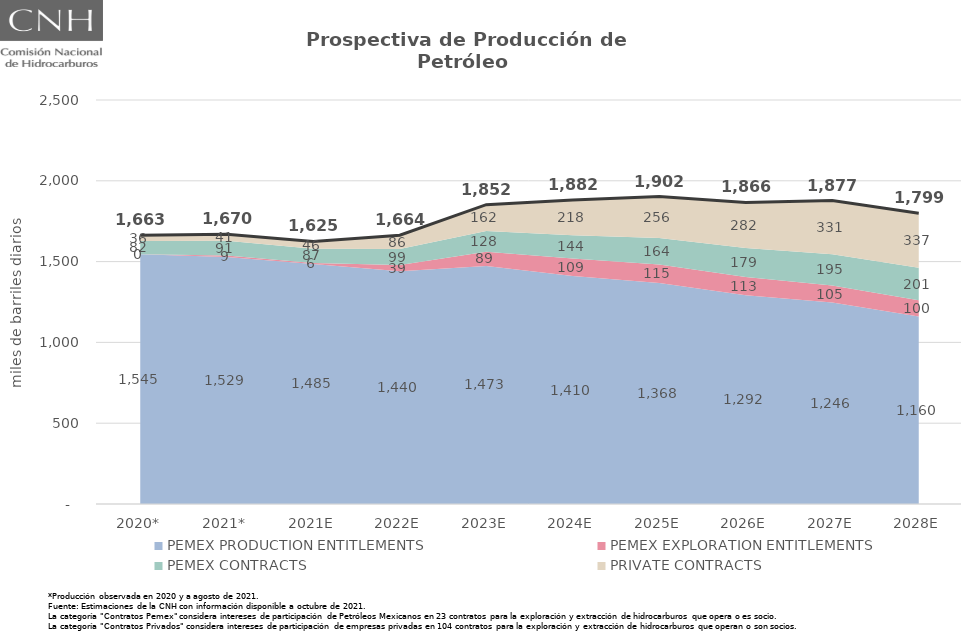
| Category | Total |
|---|---|
| 2020* | 1663.042 |
| 2021* | 1669.616 |
| 2021E | 1625.118 |
| 2022E | 1663.583 |
| 2023E | 1852.21 |
| 2024E | 1881.847 |
| 2025E | 1902.307 |
| 2026E | 1866.054 |
| 2027E | 1877.462 |
| 2028E | 1798.552 |